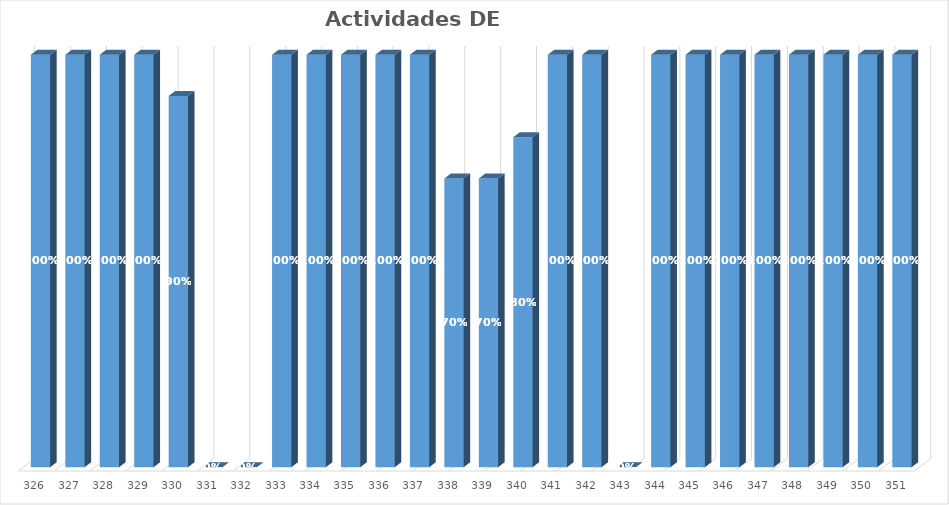
| Category | % Avance |
|---|---|
| 326.0 | 1 |
| 327.0 | 1 |
| 328.0 | 1 |
| 329.0 | 1 |
| 330.0 | 0.9 |
| 331.0 | 0 |
| 332.0 | 0 |
| 333.0 | 1 |
| 334.0 | 1 |
| 335.0 | 1 |
| 336.0 | 1 |
| 337.0 | 1 |
| 338.0 | 0.7 |
| 339.0 | 0.7 |
| 340.0 | 0.8 |
| 341.0 | 1 |
| 342.0 | 1 |
| 343.0 | 0 |
| 344.0 | 1 |
| 345.0 | 1 |
| 346.0 | 1 |
| 347.0 | 1 |
| 348.0 | 1 |
| 349.0 | 1 |
| 350.0 | 1 |
| 351.0 | 1 |